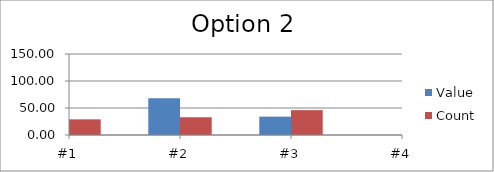
| Category | Value | Count |
|---|---|---|
| #1 | 100 | 29 |
| #2 | 68 | 33 |
| #3 | 34 | 46 |
| #4 | 0 | 50 |